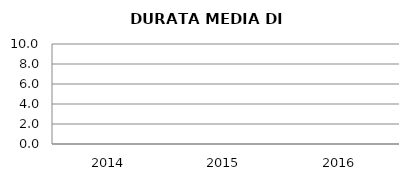
| Category | 2014 2015 2016 |
|---|---|
| 2014.0 | 0 |
| 2015.0 | 0 |
| 2016.0 | 0 |